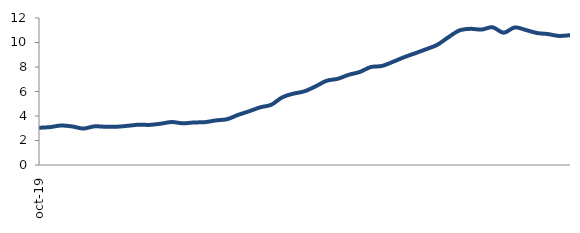
| Category | Series 0 |
|---|---|
| 2019-10-01 | 3.036 |
| 2019-11-01 | 3.095 |
| 2019-12-01 | 3.225 |
| 2020-01-01 | 3.148 |
| 2020-02-01 | 2.975 |
| 2020-03-01 | 3.153 |
| 2020-04-01 | 3.122 |
| 2020-05-01 | 3.123 |
| 2020-06-01 | 3.198 |
| 2020-07-01 | 3.289 |
| 2020-08-01 | 3.275 |
| 2020-09-01 | 3.372 |
| 2020-10-01 | 3.508 |
| 2020-11-01 | 3.402 |
| 2020-12-01 | 3.472 |
| 2021-01-01 | 3.496 |
| 2021-02-01 | 3.642 |
| 2021-03-01 | 3.737 |
| 2021-04-01 | 4.091 |
| 2021-05-01 | 4.388 |
| 2021-06-01 | 4.708 |
| 2021-07-01 | 4.92 |
| 2021-08-01 | 5.531 |
| 2021-09-01 | 5.826 |
| 2021-10-01 | 6.015 |
| 2021-11-01 | 6.418 |
| 2021-12-01 | 6.877 |
| 2022-01-01 | 7.036 |
| 2022-02-01 | 7.363 |
| 2022-03-01 | 7.597 |
| 2022-04-01 | 7.997 |
| 2022-05-01 | 8.085 |
| 2022-06-01 | 8.423 |
| 2022-07-01 | 8.799 |
| 2022-08-01 | 9.118 |
| 2022-09-01 | 9.453 |
| 2022-10-01 | 9.809 |
| 2022-11-01 | 10.425 |
| 2022-12-01 | 10.982 |
| 2023-01-01 | 11.115 |
| 2023-02-01 | 11.054 |
| 2023-03-01 | 11.245 |
| 2023-04-01 | 10.801 |
| 2023-05-01 | 11.231 |
| 2023-06-01 | 11.022 |
| 2023-07-01 | 10.776 |
| 2023-08-01 | 10.689 |
| 2023-09-01 | 10.536 |
| 2023-10-01 | 10.597 |